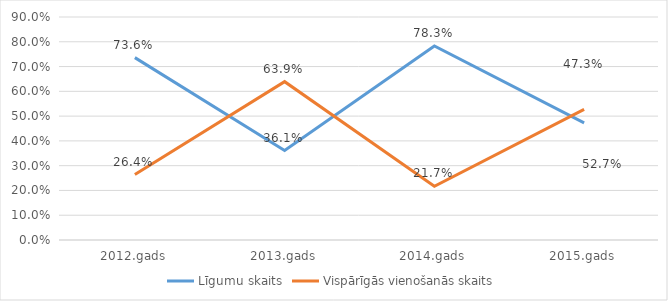
| Category | Līgumu skaits | Vispārīgās vienošanās skaits |
|---|---|---|
| 2012.gads | 0.736 | 0.264 |
| 2013.gads | 0.361 | 0.639 |
| 2014.gads | 0.783 | 0.217 |
| 2015.gads | 0.473 | 0.527 |